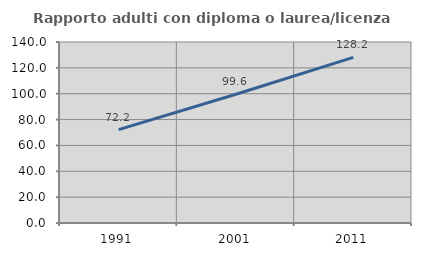
| Category | Rapporto adulti con diploma o laurea/licenza media  |
|---|---|
| 1991.0 | 72.178 |
| 2001.0 | 99.617 |
| 2011.0 | 128.157 |